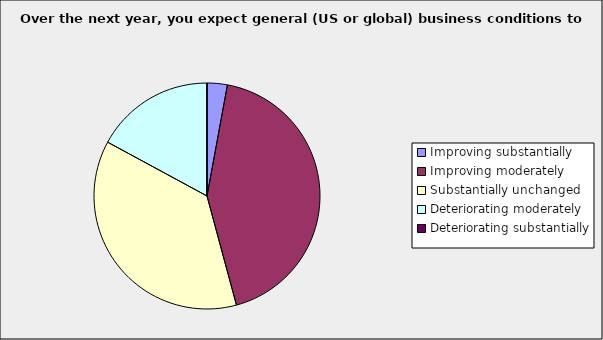
| Category | Series 0 |
|---|---|
| Improving substantially | 0.029 |
| Improving moderately | 0.429 |
| Substantially unchanged | 0.371 |
| Deteriorating moderately | 0.171 |
| Deteriorating substantially | 0 |